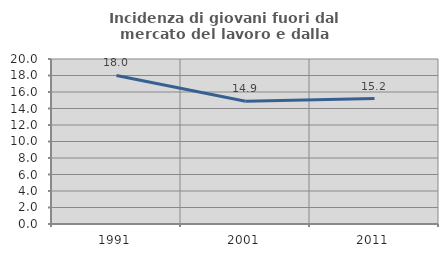
| Category | Incidenza di giovani fuori dal mercato del lavoro e dalla formazione  |
|---|---|
| 1991.0 | 18.008 |
| 2001.0 | 14.876 |
| 2011.0 | 15.209 |